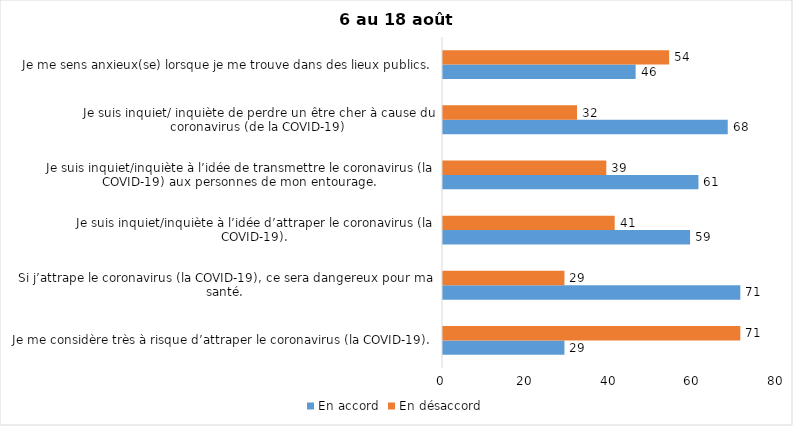
| Category | En accord | En désaccord |
|---|---|---|
| Je me considère très à risque d’attraper le coronavirus (la COVID-19). | 29 | 71 |
| Si j’attrape le coronavirus (la COVID-19), ce sera dangereux pour ma santé. | 71 | 29 |
| Je suis inquiet/inquiète à l’idée d’attraper le coronavirus (la COVID-19). | 59 | 41 |
| Je suis inquiet/inquiète à l’idée de transmettre le coronavirus (la COVID-19) aux personnes de mon entourage. | 61 | 39 |
| Je suis inquiet/ inquiète de perdre un être cher à cause du coronavirus (de la COVID-19) | 68 | 32 |
| Je me sens anxieux(se) lorsque je me trouve dans des lieux publics. | 46 | 54 |